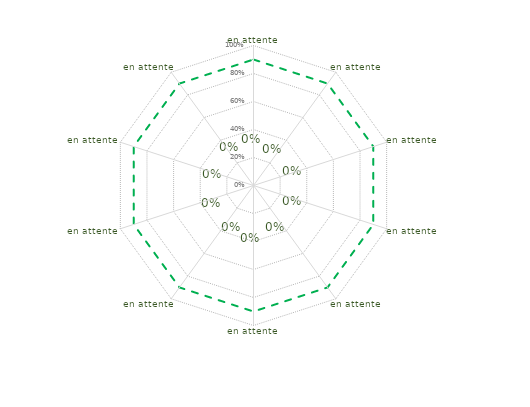
| Category | article 5 | Seuil limite |
|---|---|---|
| 0 | 0 | 0.9 |
| 1 | 0 | 0.9 |
| 2 | 0 | 0.9 |
| 3 | 0 | 0.9 |
| 4 | 0 | 0.9 |
| 5 | 0 | 0.9 |
| 6 | 0 | 0.9 |
| 7 | 0 | 0.9 |
| 8 | 0 | 0.9 |
| 9 | 0 | 0.9 |